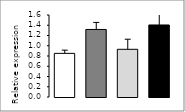
| Category | Series 0 |
|---|---|
| 0 | 0.851 |
| 1 | 1.318 |
| 2 | 0.931 |
| 3 | 1.405 |